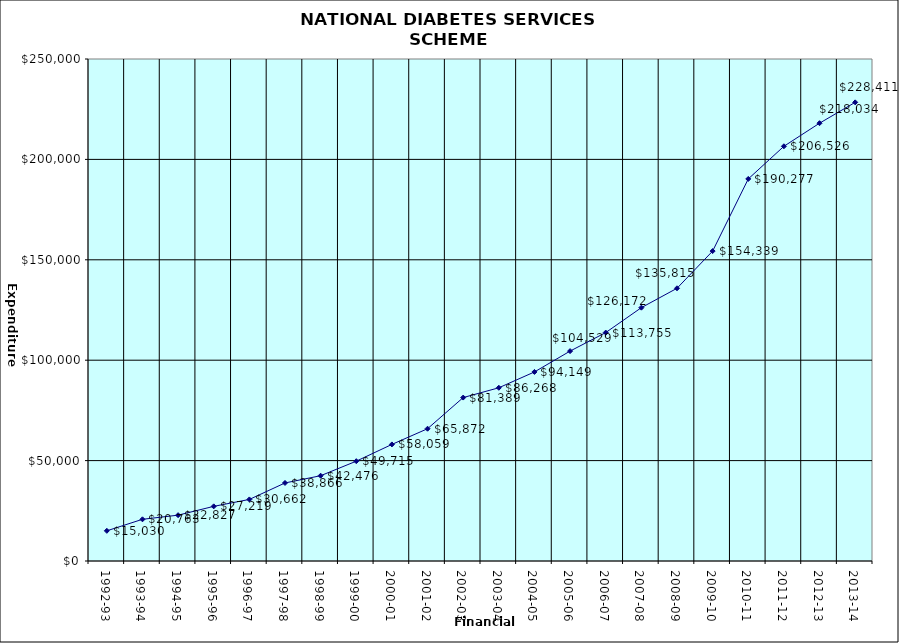
| Category | Series 0 |
|---|---|
| 1992-93 | 15030 |
| 1993-94 | 20763 |
| 1994-95 | 22827 |
| 1995-96 | 27219 |
| 1996-97 | 30662 |
| 1997-98 | 38866 |
| 1998-99 | 42476 |
| 1999-00 | 49715 |
| 2000-01 | 58059 |
| 2001-02 | 65872 |
| 2002-03 | 81389 |
| 2003-04 | 86268 |
| 2004-05 | 94149 |
| 2005-06 | 104529 |
| 2006-07 | 113755 |
| 2007-08 | 126172 |
| 2008-09 | 135815 |
| 2009-10 | 154339 |
| 2010-11 | 190277 |
| 2011-12 | 206526 |
| 2012-13 | 218034 |
| 2013-14 | 228411 |